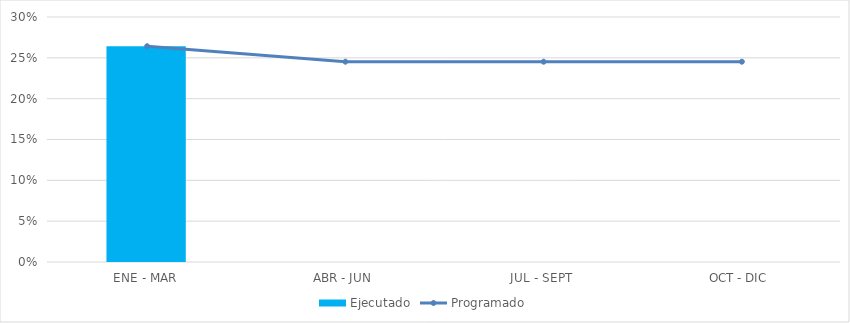
| Category | Ejecutado |
|---|---|
| ENE - MAR | 0.264 |
| ABR - JUN | 0 |
| JUL - SEPT | 0 |
| OCT - DIC | 0 |